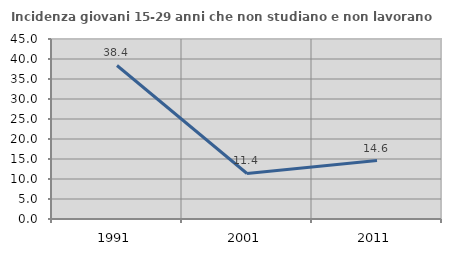
| Category | Incidenza giovani 15-29 anni che non studiano e non lavorano  |
|---|---|
| 1991.0 | 38.376 |
| 2001.0 | 11.382 |
| 2011.0 | 14.601 |